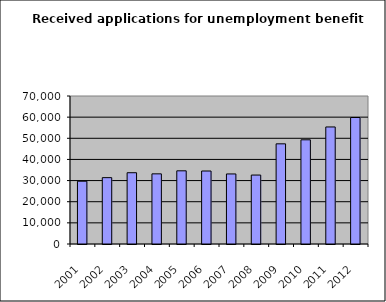
| Category | Series 1 |
|---|---|
| 2001.0 | 29694 |
| 2002.0 | 31386 |
| 2003.0 | 33712 |
| 2004.0 | 33179 |
| 2005.0 | 34612 |
| 2006.0 | 34527 |
| 2007.0 | 33131 |
| 2008.0 | 32607 |
| 2009.0 | 47377 |
| 2010.0 | 49282 |
| 2011.0 | 55358 |
| 2012.0 | 59830 |